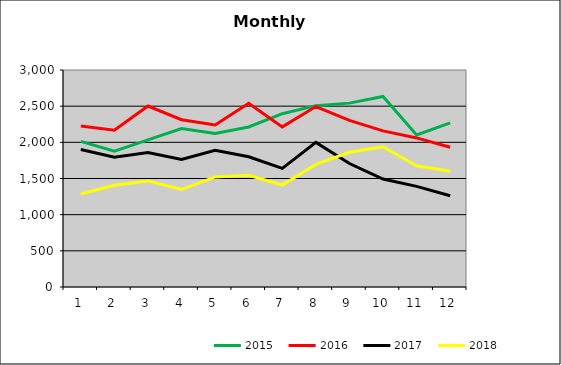
| Category | 2015 | 2016 | 2017 | 2018 |
|---|---|---|---|---|
| 0 | 2012.541 | 2226.188 | 1900.859 | 1286.21 |
| 1 | 1876.319 | 2166.497 | 1795.105 | 1406.556 |
| 2 | 2033.639 | 2501.903 | 1859.386 | 1466.695 |
| 3 | 2190.038 | 2312.349 | 1764.013 | 1347.408 |
| 4 | 2122.18 | 2240.561 | 1891.399 | 1522.181 |
| 5 | 2212.445 | 2540.235 | 1800.236 | 1543.945 |
| 6 | 2396.234 | 2213.485 | 1640.121 | 1409.491 |
| 7 | 2507.021 | 2494.361 | 1999.331 | 1694.901 |
| 8 | 2542.091 | 2304.009 | 1706.874 | 1861.88 |
| 9 | 2633.621 | 2158.544 | 1492.036 | 1938.743 |
| 10 | 2103.155 | 2060.966 | 1390.86 | 1676.82 |
| 11 | 2268.667 | 1932.97 | 1261.902 | 1598.863 |